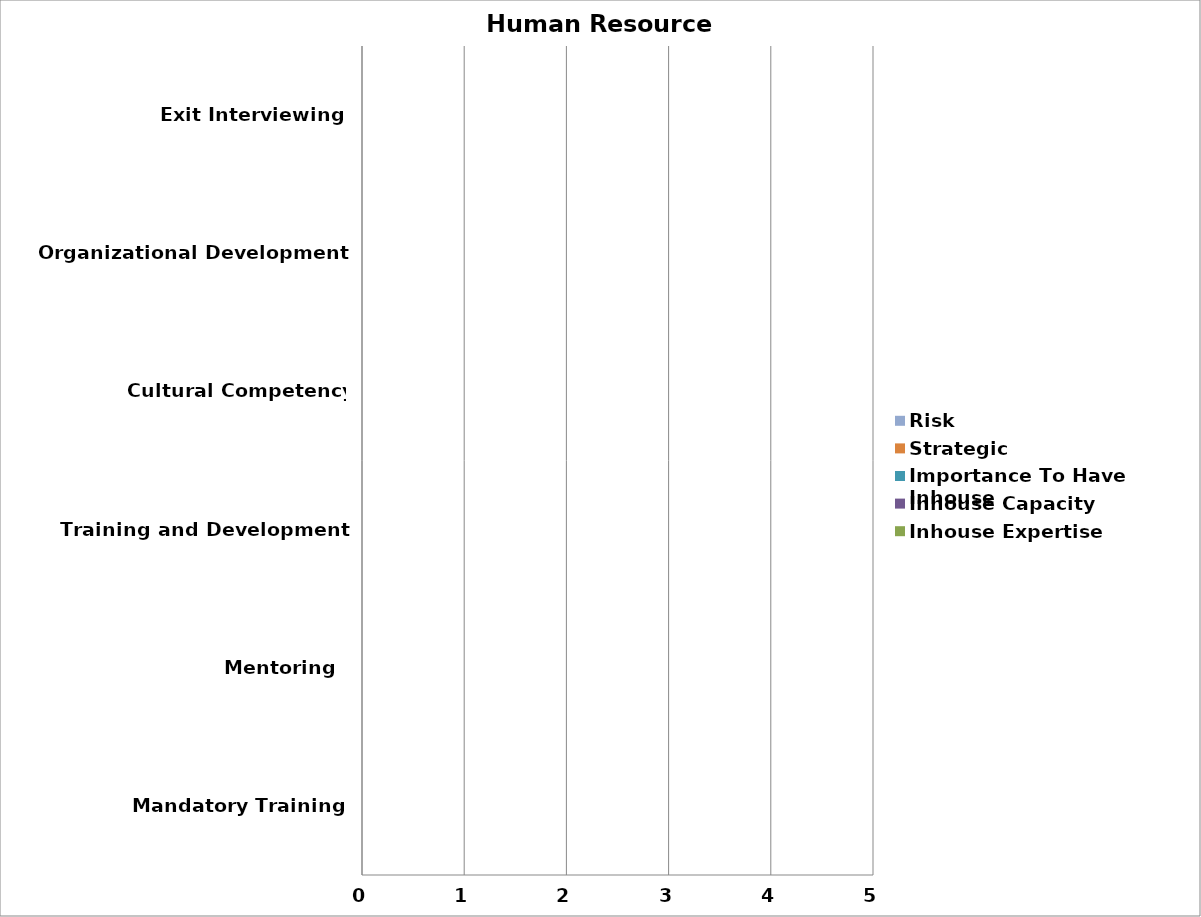
| Category | Inhouse Expertise | Inhouse Capacity | Importance To Have Inhouse | Strategic | Risk |
|---|---|---|---|---|---|
| Mandatory Training | 0 | 0 | 0 | 0 | 0 |
| Mentoring  | 0 | 0 | 0 | 0 | 0 |
| Training and Development | 0 | 0 | 0 | 0 | 0 |
| Cultural Competency Development | 0 | 0 | 0 | 0 | 0 |
| Organizational Development | 0 | 0 | 0 | 0 | 0 |
| Exit Interviewing | 0 | 0 | 0 | 0 | 0 |